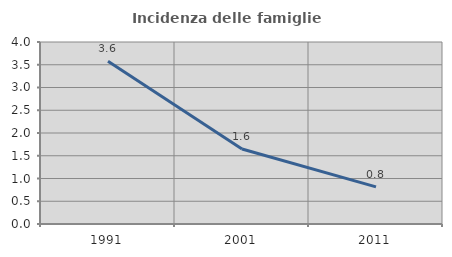
| Category | Incidenza delle famiglie numerose |
|---|---|
| 1991.0 | 3.579 |
| 2001.0 | 1.649 |
| 2011.0 | 0.817 |